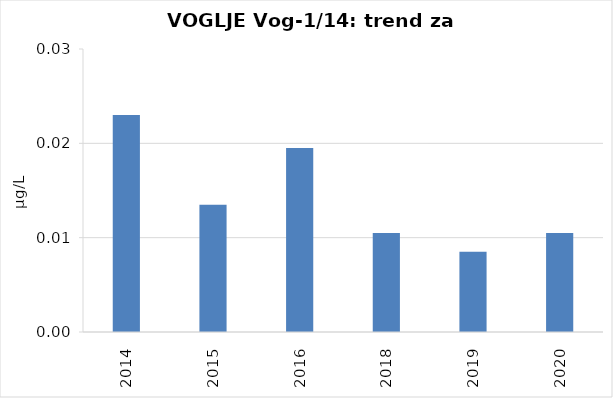
| Category | Vsota |
|---|---|
| 2014 | 0.023 |
| 2015 | 0.014 |
| 2016 | 0.02 |
| 2018 | 0.01 |
| 2019 | 0.008 |
| 2020 | 0.01 |